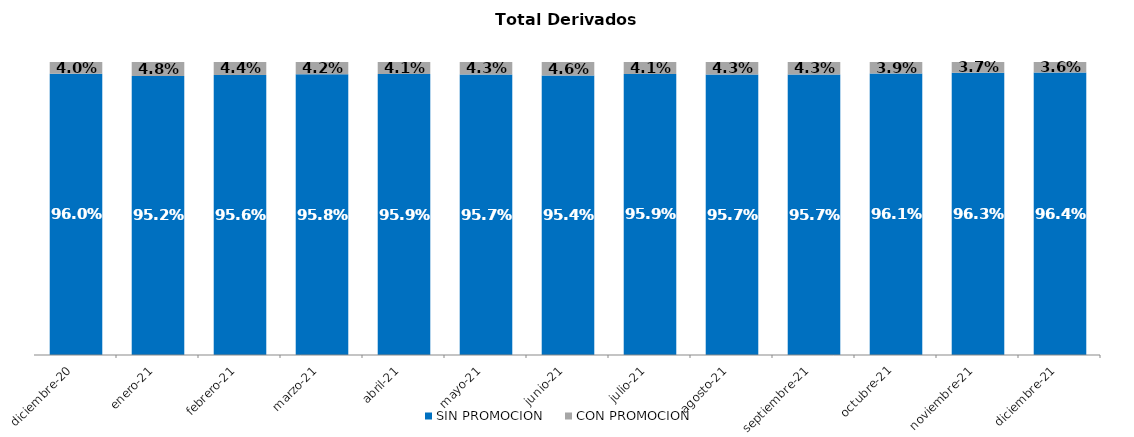
| Category | SIN PROMOCION   | CON PROMOCION   |
|---|---|---|
| 2020-12-01 | 0.96 | 0.04 |
| 2021-01-01 | 0.952 | 0.048 |
| 2021-02-01 | 0.956 | 0.044 |
| 2021-03-01 | 0.958 | 0.042 |
| 2021-04-01 | 0.959 | 0.041 |
| 2021-05-01 | 0.957 | 0.043 |
| 2021-06-01 | 0.954 | 0.046 |
| 2021-07-01 | 0.959 | 0.041 |
| 2021-08-01 | 0.957 | 0.043 |
| 2021-09-01 | 0.957 | 0.043 |
| 2021-10-01 | 0.961 | 0.039 |
| 2021-11-01 | 0.963 | 0.037 |
| 2021-12-01 | 0.964 | 0.036 |